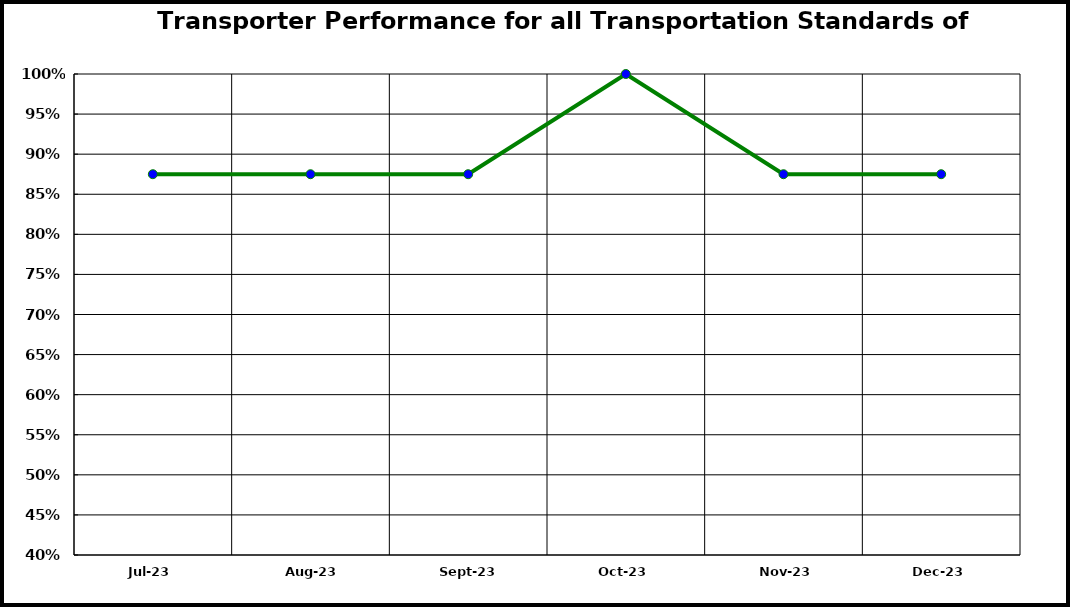
| Category | Performance |
|---|---|
| 2023-07-01 | 0.875 |
| 2023-08-01 | 0.875 |
| 2023-09-01 | 0.875 |
| 2023-10-01 | 1 |
| 2023-11-01 | 0.875 |
| 2023-12-01 | 0.875 |